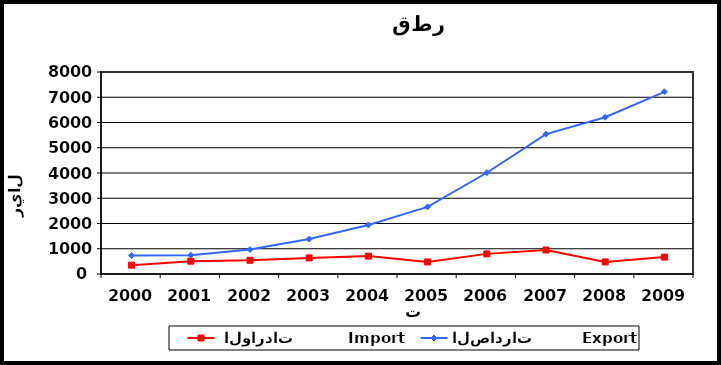
| Category |  الواردات           Import | الصادرات          Export |
|---|---|---|
| 2000.0 | 349 | 731 |
| 2001.0 | 507 | 743 |
| 2002.0 | 544 | 970 |
| 2003.0 | 637 | 1383 |
| 2004.0 | 708 | 1944 |
| 2005.0 | 478 | 2659 |
| 2006.0 | 797 | 4010 |
| 2007.0 | 950 | 5540 |
| 2008.0 | 478 | 6209 |
| 2009.0 | 669 | 7216 |